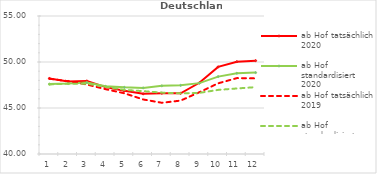
| Category | ab Hof tatsächlich 2020 | ab Hof standardisiert 2020 | ab Hof tatsächlich 2019 | ab Hof standardisiert 2019 |
|---|---|---|---|---|
| 0 | 48.212 | 47.6 | 48.181 | 47.557 |
| 1 | 47.893 | 47.65 | 47.916 | 47.647 |
| 2 | 47.938 | 47.761 | 47.556 | 47.645 |
| 3 | 47.267 | 47.353 | 47.043 | 47.307 |
| 4 | 46.866 | 47.244 | 46.601 | 46.974 |
| 5 | 46.538 | 47.187 | 45.928 | 46.83 |
| 6 | 46.606 | 47.407 | 45.568 | 46.674 |
| 7 | 46.595 | 47.464 | 45.804 | 46.592 |
| 8 | 47.742 | 47.703 | 46.714 | 46.644 |
| 9 | 49.467 | 48.412 | 47.681 | 46.968 |
| 10 | 50.034 | 48.775 | 48.249 | 47.122 |
| 11 | 50.146 | 48.846 | 48.221 | 47.267 |